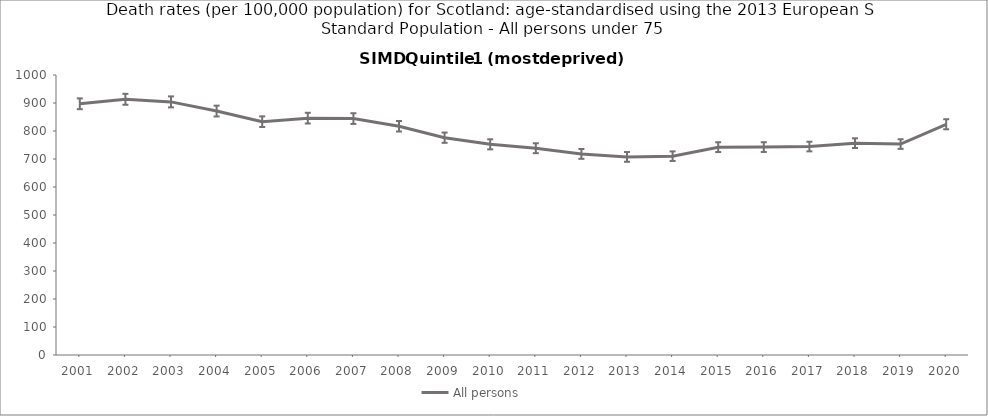
| Category | All persons |
|---|---|
| 2001.0 | 897.2 |
| 2002.0 | 913.2 |
| 2003.0 | 904 |
| 2004.0 | 871.2 |
| 2005.0 | 833.3 |
| 2006.0 | 845.9 |
| 2007.0 | 844.4 |
| 2008.0 | 817 |
| 2009.0 | 776.1 |
| 2010.0 | 752.4 |
| 2011.0 | 738.5 |
| 2012.0 | 718.2 |
| 2013.0 | 707.5 |
| 2014.0 | 710.1 |
| 2015.0 | 742.3 |
| 2016.0 | 742.5 |
| 2017.0 | 744.5 |
| 2018.0 | 756.6 |
| 2019.0 | 753.4 |
| 2020.0 | 824.1 |